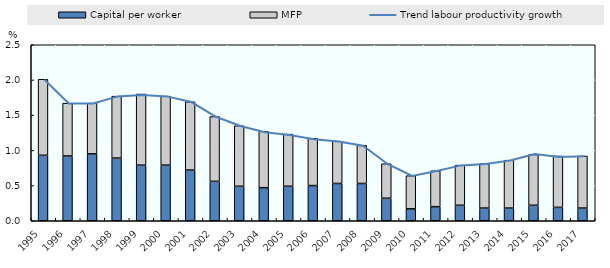
| Category | Capital per worker | MFP |
|---|---|---|
| 1995.0 | 0.93 | 1.08 |
| 1996.0 | 0.92 | 0.75 |
| 1997.0 | 0.95 | 0.72 |
| 1998.0 | 0.89 | 0.88 |
| 1999.0 | 0.79 | 1.01 |
| 2000.0 | 0.79 | 0.98 |
| 2001.0 | 0.72 | 0.97 |
| 2002.0 | 0.56 | 0.92 |
| 2003.0 | 0.49 | 0.86 |
| 2004.0 | 0.47 | 0.8 |
| 2005.0 | 0.49 | 0.74 |
| 2006.0 | 0.5 | 0.67 |
| 2007.0 | 0.53 | 0.6 |
| 2008.0 | 0.53 | 0.54 |
| 2009.0 | 0.32 | 0.49 |
| 2010.0 | 0.17 | 0.47 |
| 2011.0 | 0.2 | 0.51 |
| 2012.0 | 0.22 | 0.57 |
| 2013.0 | 0.18 | 0.63 |
| 2014.0 | 0.18 | 0.68 |
| 2015.0 | 0.22 | 0.72 |
| 2016.0 | 0.19 | 0.73 |
| 2017.0 | 0.18 | 0.74 |